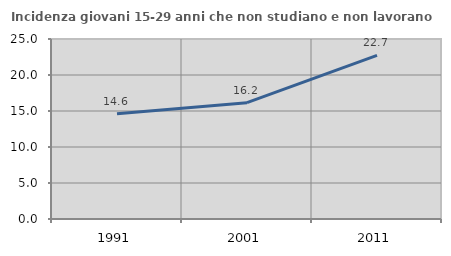
| Category | Incidenza giovani 15-29 anni che non studiano e non lavorano  |
|---|---|
| 1991.0 | 14.634 |
| 2001.0 | 16.156 |
| 2011.0 | 22.727 |